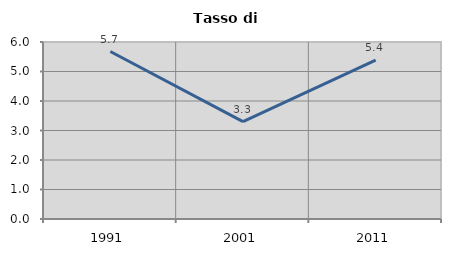
| Category | Tasso di disoccupazione   |
|---|---|
| 1991.0 | 5.677 |
| 2001.0 | 3.3 |
| 2011.0 | 5.386 |